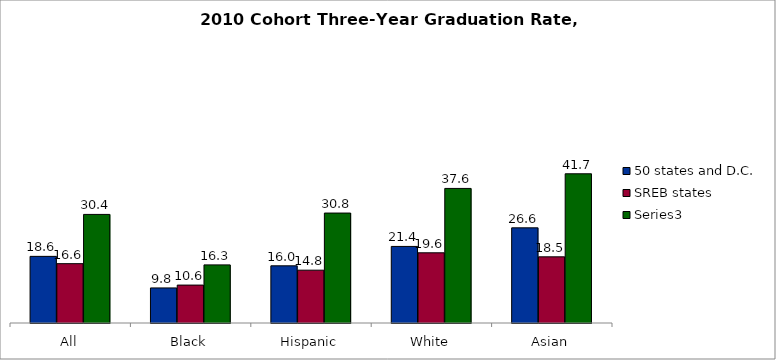
| Category | 50 states and D.C. | SREB states | Series 2 |
|---|---|---|---|
| All | 18.637 | 16.6 | 30.375 |
| Black | 9.812 | 10.605 | 16.257 |
| Hispanic | 15.995 | 14.775 | 30.755 |
| White | 21.419 | 19.635 | 37.64 |
| Asian | 26.619 | 18.508 | 41.739 |